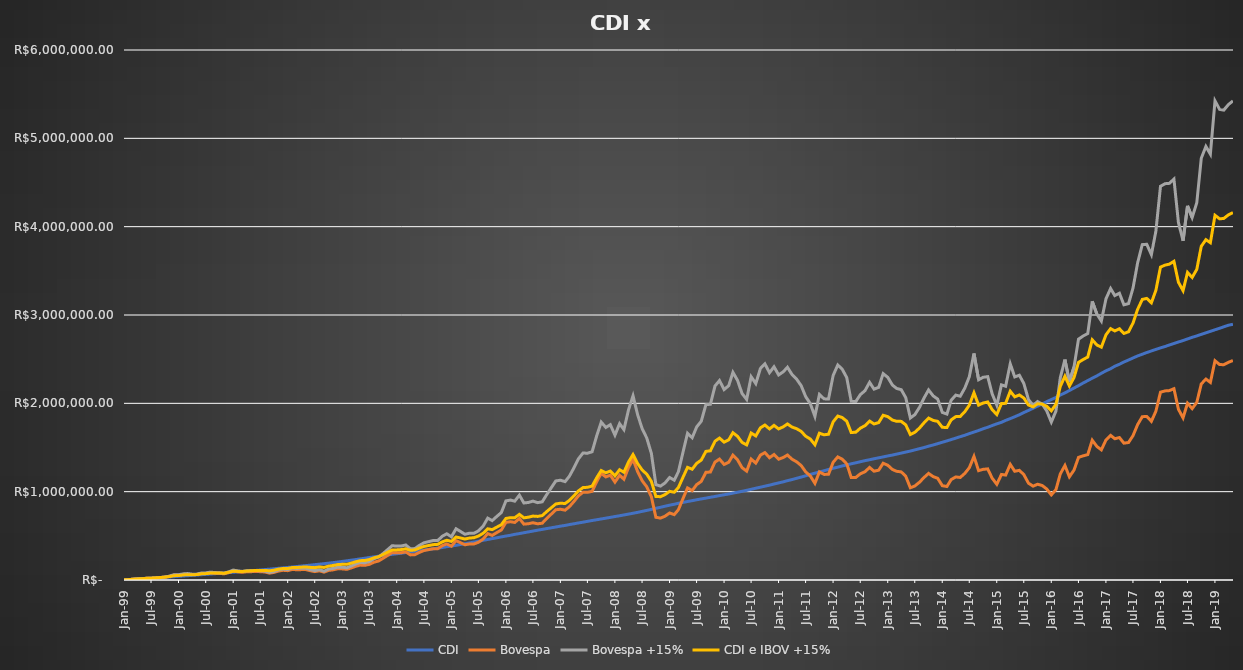
| Category | CDI | Bovespa | Bovespa +15% | CDI e IBOV +15% |
|---|---|---|---|---|
| 1999-01-01 | 1000 | 1000 | 1000 | 1000 |
| 1999-01-01 | 1021.7 | 1204.5 | 1235.175 | 1128.438 |
| 1999-02-01 | 4116.21 | 4585.428 | 4676.438 | 4396.324 |
| 1999-03-01 | 7349.622 | 9104.789 | 9444.667 | 8397.144 |
| 1999-04-01 | 10585.593 | 12845.602 | 13320.523 | 11953.058 |
| 1999-05-01 | 13851.871 | 15481.153 | 15945.151 | 14898.511 |
| 1999-06-01 | 17128.241 | 19375.641 | 19999.638 | 18563.94 |
| 1999-07-01 | 20454.319 | 20095.563 | 20655.975 | 20555.147 |
| 1999-08-01 | 23817.861 | 23368.091 | 23976.986 | 23897.423 |
| 1999-09-01 | 27212.083 | 27718.137 | 28565.391 | 27888.737 |
| 1999-10-01 | 30629.01 | 32361.557 | 33507.452 | 32068.231 |
| 1999-11-01 | 34089.728 | 41645.306 | 43967.932 | 39028.83 |
| 1999-12-01 | 37675.745 | 55378.038 | 59952.687 | 48814.216 |
| 2000-01-01 | 41261.476 | 55972.862 | 60359.036 | 50810.256 |
| 2000-02-01 | 44898.841 | 63549.157 | 69013.196 | 56956.019 |
| 2000-03-01 | 48588.584 | 67154.754 | 72766.814 | 60677.699 |
| 2000-04-01 | 52248.918 | 61167.93 | 66061.086 | 59155.002 |
| 2000-05-01 | 56072.127 | 61768.049 | 66478.201 | 61275.164 |
| 2000-06-01 | 59893.23 | 72436.586 | 78938.353 | 69415.791 |
| 2000-07-01 | 63710.842 | 74206.97 | 80602.758 | 72156.8 |
| 2000-08-01 | 67644.794 | 81391.588 | 88813.717 | 78229.256 |
| 2000-09-01 | 71506.66 | 77488.356 | 84303.355 | 77905.008 |
| 2000-10-01 | 75460.345 | 75127.831 | 81488.952 | 78474.649 |
| 2000-11-01 | 79409.716 | 69822.843 | 75507.776 | 77458.746 |
| 2000-12-01 | 83390.391 | 83629.753 | 91905.913 | 87648.152 |
| 2001-01-01 | 87478.91 | 100334.58 | 112172.146 | 99825.528 |
| 2001-02-01 | 91392.747 | 92918.454 | 103562.794 | 97477.77 |
| 2001-03-01 | 95572.656 | 87151.507 | 96822.955 | 96197.805 |
| 2001-04-01 | 99735.814 | 93144.537 | 103634.195 | 101685.004 |
| 2001-05-01 | 104102.2 | 94423.55 | 104725.443 | 104413.821 |
| 2001-06-01 | 108462.398 | 96819.524 | 107057.545 | 107759.972 |
| 2001-07-01 | 113134.334 | 94299.505 | 103971.363 | 108552.848 |
| 2001-08-01 | 117992.483 | 90838.817 | 99868.464 | 108930.474 |
| 2001-09-01 | 122589.584 | 77726.692 | 85205.949 | 103897.767 |
| 2001-10-01 | 127523.664 | 86256.471 | 95154.373 | 111339.018 |
| 2001-11-01 | 132337.943 | 101564.938 | 113720.184 | 123029.063 |
| 2001-12-01 | 137219.14 | 109782.729 | 123418.172 | 130318.656 |
| 2002-01-01 | 142364.493 | 105666.139 | 118441.185 | 130402.839 |
| 2002-02-01 | 147181.549 | 119869.617 | 135839.859 | 141510.704 |
| 2002-03-01 | 152239.036 | 116050.354 | 131134.247 | 141686.642 |
| 2002-04-01 | 157536.574 | 117526.509 | 132417.329 | 144976.951 |
| 2002-05-01 | 162784.086 | 118465.506 | 133101.692 | 147942.889 |
| 2002-06-01 | 167955.858 | 105201.275 | 117877.676 | 142916.767 |
| 2002-07-01 | 173588.578 | 94827.597 | 105937.195 | 139762.886 |
| 2002-08-01 | 179149.112 | 104039.649 | 116892.334 | 148020.723 |
| 2002-09-01 | 184662.77 | 88896.429 | 99570.583 | 142116.676 |
| 2002-10-01 | 190740.439 | 108364.269 | 123708.329 | 157224.384 |
| 2002-11-01 | 196704.668 | 115094.972 | 131589.767 | 164147.218 |
| 2002-12-01 | 203159.559 | 126633.238 | 145780.233 | 174469.896 |
| 2003-01-01 | 210220.902 | 125860.911 | 144450.729 | 177335.815 |
| 2003-02-01 | 217122.845 | 121077.712 | 138544.705 | 177833.775 |
| 2003-03-01 | 224019.019 | 136063.619 | 157268.906 | 190643.962 |
| 2003-04-01 | 231264.275 | 154889.059 | 181243.298 | 206253.786 |
| 2003-05-01 | 238855.854 | 168767.615 | 198841.815 | 218848.835 |
| 2003-06-01 | 246330.188 | 166013.4 | 195080.114 | 220705.151 |
| 2003-07-01 | 254516.256 | 176821.819 | 208604.111 | 231560.183 |
| 2003-08-01 | 262048.542 | 201058.776 | 240343.123 | 251195.832 |
| 2003-09-01 | 269474.852 | 215302.414 | 258762.56 | 264118.706 |
| 2003-10-01 | 276916.192 | 245197.272 | 298849.08 | 287882.636 |
| 2003-11-01 | 283667.069 | 278576.618 | 344337.356 | 314002.213 |
| 2003-12-01 | 290594.408 | 310212.96 | 387960.197 | 339277.302 |
| 2004-01-01 | 297293.698 | 307794.376 | 384196.585 | 340745.142 |
| 2004-02-01 | 303536.87 | 309426.881 | 385492.92 | 344514.895 |
| 2004-03-01 | 310736.425 | 317988.079 | 396445.37 | 353590.898 |
| 2004-04-01 | 317407.141 | 284234.944 | 353708.875 | 335558.008 |
| 2004-05-01 | 324316.108 | 286315.792 | 355567.407 | 339941.758 |
| 2004-06-01 | 331309.365 | 313068.619 | 392421.549 | 361865.457 |
| 2004-07-01 | 338588.525 | 333831.675 | 420977.643 | 379783.084 |
| 2004-08-01 | 345995.016 | 343871.457 | 434167.946 | 390081.481 |
| 2004-09-01 | 353322.555 | 353600.763 | 446921.163 | 400121.859 |
| 2004-10-01 | 360634.058 | 353640.977 | 446186.817 | 403410.437 |
| 2004-11-01 | 368179.483 | 388774.329 | 495729.309 | 431954.396 |
| 2004-12-01 | 376672.94 | 408424.738 | 523104.704 | 449888.822 |
| 2005-01-01 | 384912.426 | 382460.437 | 489066.933 | 436989.68 |
| 2005-02-01 | 392644.958 | 445399.534 | 580060.803 | 486352.88 |
| 2005-03-01 | 401658.761 | 424051.44 | 551400.601 | 476529.681 |
| 2005-04-01 | 410364.45 | 398695.224 | 517588.401 | 463976.425 |
| 2005-05-01 | 419564.916 | 407559.974 | 529329.08 | 474446.998 |
| 2005-06-01 | 429241.442 | 408014.503 | 529028.64 | 479135.041 |
| 2005-07-01 | 438768.288 | 427290.677 | 556257.224 | 497512.756 |
| 2005-08-01 | 449057.465 | 463380.03 | 608715.137 | 528886.301 |
| 2005-09-01 | 458838.327 | 525237.19 | 700493.355 | 579665.841 |
| 2005-10-01 | 468304.063 | 504994.753 | 672539.647 | 570421.855 |
| 2005-11-01 | 477808.059 | 537001.254 | 719898.958 | 598853.509 |
| 2005-12-01 | 487875.938 | 566029.314 | 762969.247 | 625422.593 |
| 2006-01-01 | 497895.464 | 652847.332 | 895720.608 | 696808.036 |
| 2006-02-01 | 506605.672 | 659716.831 | 904818.427 | 705712.05 |
| 2006-03-01 | 516842.073 | 651384.374 | 892294.732 | 704568.402 |
| 2006-04-01 | 525456.367 | 695937.781 | 960673.63 | 743064.998 |
| 2006-05-01 | 535220.608 | 632538.692 | 872124.635 | 703672.622 |
| 2006-06-01 | 544571.612 | 637318.2 | 877942.537 | 711257.074 |
| 2006-07-01 | 553978.199 | 648130.082 | 893302.16 | 723640.18 |
| 2006-08-01 | 563940.427 | 636284.317 | 875866.471 | 719903.449 |
| 2006-09-01 | 572893.301 | 643120.022 | 884930.65 | 728911.976 |
| 2006-10-01 | 582170.538 | 696000.488 | 966761.133 | 774465.836 |
| 2006-11-01 | 591139.278 | 746532.521 | 1045596.453 | 818367.866 |
| 2006-12-01 | 599961.843 | 794954.192 | 1121673.14 | 860817.491 |
| 2007-01-01 | 609473.831 | 800986.418 | 1129587.962 | 869530.896 |
| 2007-02-01 | 617802.353 | 790479.446 | 1113560.484 | 865681.419 |
| 2007-03-01 | 627320.778 | 828075.15 | 1172544.827 | 899932.802 |
| 2007-04-01 | 636245.793 | 888253.121 | 1268553.933 | 952399.863 |
| 2007-05-01 | 645766.1 | 951590.957 | 1370550.765 | 1008158.433 |
| 2007-06-01 | 654604.995 | 993347.35 | 1437681.85 | 1046143.423 |
| 2007-07-01 | 663983.763 | 992461.595 | 1435063.191 | 1049523.477 |
| 2007-08-01 | 673586.903 | 1003823.472 | 1451954.881 | 1062770.892 |
| 2007-09-01 | 681999.598 | 1114251.537 | 1633485.12 | 1157742.359 |
| 2007-10-01 | 691301.594 | 1206966.835 | 1787606.338 | 1239453.966 |
| 2007-11-01 | 700133.728 | 1167134.009 | 1727218.874 | 1213676.301 |
| 2007-12-01 | 709040.051 | 1186515.885 | 1758075.398 | 1233557.724 |
| 2008-01-01 | 718602.212 | 1107677.193 | 1639913.411 | 1179257.811 |
| 2008-02-01 | 727337.506 | 1185314.7 | 1769877.759 | 1248607.633 |
| 2008-03-01 | 736459.926 | 1141138.606 | 1702494.512 | 1219477.219 |
| 2008-04-01 | 746100.276 | 1273655.096 | 1927515.787 | 1336808.032 |
| 2008-05-01 | 755624.939 | 1365510.291 | 2085034.271 | 1420329.605 |
| 2008-06-01 | 765818.221 | 1225774.668 | 1870252.297 | 1318035.259 |
| 2008-07-01 | 776998.447 | 1124574.576 | 1714400.502 | 1245699.474 |
| 2008-08-01 | 787898.271 | 1055071.531 | 1606971.65 | 1197434.96 |
| 2008-09-01 | 799584.707 | 941366.241 | 1432391.777 | 1115988.242 |
| 2008-10-01 | 812006.249 | 710163.413 | 1079414.616 | 945710.432 |
| 2008-11-01 | 823123.711 | 700540.421 | 1063255.877 | 943189.794 |
| 2008-12-01 | 835301.945 | 721902.826 | 1098259.547 | 966780.746 |
| 2009-01-01 | 847042.92 | 758683.297 | 1160276.047 | 1003659.483 |
| 2009-02-01 | 857291.236 | 740051.492 | 1130239.007 | 993765.121 |
| 2009-03-01 | 868605.951 | 796402.589 | 1226810.552 | 1047708.251 |
| 2009-04-01 | 878889.09 | 923709.691 | 1449731.424 | 1164310.257 |
| 2009-05-01 | 888647.888 | 1042455.732 | 1661394.502 | 1275021.195 |
| 2009-06-01 | 898347.73 | 1011373.875 | 1610135.241 | 1254241.485 |
| 2009-07-01 | 908414.296 | 1079395.24 | 1732047.505 | 1320230.901 |
| 2009-08-01 | 917715.815 | 1116490.691 | 1797899.601 | 1357807.708 |
| 2009-09-01 | 927082.565 | 1219125.362 | 1985221.675 | 1456152.12 |
| 2009-10-01 | 936511.295 | 1222614.212 | 1989136.257 | 1462823.776 |
| 2009-11-01 | 945702.675 | 1335061.561 | 2196718.69 | 1571210.682 |
| 2009-12-01 | 955569.385 | 1368836.977 | 2257901.25 | 1606735.317 |
| 2010-01-01 | 964878.688 | 1308046.558 | 2155769.341 | 1560324.015 |
| 2010-02-01 | 973613.37 | 1333072.14 | 2200476.765 | 1587045.067 |
| 2010-03-01 | 984005.356 | 1413831.538 | 2350955.465 | 1667480.411 |
| 2010-04-01 | 993558.085 | 1359591.544 | 2258855.664 | 1626206.874 |
| 2010-05-01 | 1004032.27 | 1272115.466 | 2111668.448 | 1557850.359 |
| 2010-06-01 | 1014995.882 | 1232399.098 | 2043827.055 | 1529411.468 |
| 2010-07-01 | 1026742.502 | 1368822.2 | 2301042.975 | 1663892.739 |
| 2010-08-01 | 1038869.11 | 1323671.241 | 2223171.067 | 1631020.088 |
| 2010-09-01 | 1050667.695 | 1413966.209 | 2394625.432 | 1722646.563 |
| 2010-10-01 | 1062156.042 | 1442329.904 | 2446980.551 | 1754568.296 |
| 2010-11-01 | 1073736.939 | 1384626.048 | 2347081.368 | 1710409.153 |
| 2010-12-01 | 1086719.367 | 1420374.023 | 2413862.576 | 1750290.971 |
| 2011-01-01 | 1099097.492 | 1367293.086 | 2321638.191 | 1710367.841 |
| 2011-02-01 | 1111381.561 | 1386873.632 | 2356985.531 | 1734183.546 |
| 2011-03-01 | 1124620.499 | 1414752.37 | 2408565.833 | 1766593.166 |
| 2011-04-01 | 1137078.979 | 1366996.836 | 2325231.776 | 1731155.378 |
| 2011-05-01 | 1151311.038 | 1338623.908 | 2274915.269 | 1713113.153 |
| 2011-06-01 | 1165307.004 | 1295606.208 | 2199782.775 | 1682544.89 |
| 2011-07-01 | 1179598.692 | 1224066.212 | 2076343.044 | 1627970.868 |
| 2011-08-01 | 1195279.697 | 1178474.39 | 1997001.059 | 1596140.378 |
| 2011-09-01 | 1209539.932 | 1094281.58 | 1852400.981 | 1530970.456 |
| 2011-10-01 | 1223218.771 | 1223359.233 | 2100564.39 | 1661891.58 |
| 2011-11-01 | 1236747.085 | 1195577.616 | 2050764.924 | 1643756.004 |
| 2011-12-01 | 1250961.837 | 1196060.603 | 2049452.017 | 1650206.927 |
| 2012-01-01 | 1265063.162 | 1332516.049 | 2315155.613 | 1790109.387 |
| 2012-02-01 | 1277465.85 | 1393477.445 | 2433854.76 | 1855660.305 |
| 2012-03-01 | 1290815.855 | 1368827.192 | 2388605.036 | 1839710.445 |
| 2012-04-01 | 1302871.273 | 1314621.998 | 2291875.106 | 1797373.189 |
| 2012-05-01 | 1315435.474 | 1161352.029 | 2022702.918 | 1669069.196 |
| 2012-06-01 | 1326853.684 | 1161441.149 | 2020638.661 | 1673746.173 |
| 2012-07-01 | 1338835.516 | 1201819.71 | 2098341.282 | 1718588.399 |
| 2012-08-01 | 1351047.217 | 1225542.609 | 2142905.812 | 1746976.515 |
| 2012-09-01 | 1361319.804 | 1274121.539 | 2237460.884 | 1799390.344 |
| 2012-10-01 | 1372603.954 | 1231656.013 | 2160700.476 | 1766652.215 |
| 2012-11-01 | 1383092.742 | 1243422.07 | 2181367.091 | 1782229.917 |
| 2012-12-01 | 1393497.25 | 1321830.606 | 2336344.431 | 1864920.84 |
| 2013-01-01 | 1404689.103 | 1298996.409 | 2293727.215 | 1849208.159 |
| 2013-02-01 | 1414467.126 | 1251088.349 | 2206925.181 | 1810696.153 |
| 2013-03-01 | 1425088.846 | 1230636.897 | 2168599.58 | 1796844.213 |
| 2013-04-01 | 1436668.804 | 1224014.529 | 2154661.103 | 1795664.954 |
| 2013-05-01 | 1448087.987 | 1174252.905 | 2064881.676 | 1756484.831 |
| 2013-06-01 | 1459676.977 | 1044105.601 | 1834004.258 | 1646840.618 |
| 2013-07-01 | 1473042.969 | 1064278.133 | 1871650.158 | 1672346.564 |
| 2013-08-01 | 1486311.8 | 1106553.968 | 1953985.353 | 1720148.576 |
| 2013-09-01 | 1499723.579 | 1161148.228 | 2061635.145 | 1780679.362 |
| 2013-10-01 | 1514794.957 | 1206756.053 | 2151535.638 | 1833165.298 |
| 2013-11-01 | 1528578.89 | 1170197.03 | 2084082.323 | 1806330.607 |
| 2013-12-01 | 1543529.8 | 1151375.565 | 2048262.592 | 1795896.196 |
| 2014-01-01 | 1559516.011 | 1067681.96 | 1897212.771 | 1728364.391 |
| 2014-02-01 | 1574744.261 | 1058476.186 | 1878550.345 | 1726647.303 |
| 2014-03-01 | 1589733.54 | 1136310.257 | 2034097.04 | 1811915.29 |
| 2014-04-01 | 1605720.689 | 1166653.703 | 2093320.918 | 1849520.804 |
| 2014-05-01 | 1622526.73 | 1160881.3 | 2080598.511 | 1851562.621 |
| 2014-06-01 | 1638813.786 | 1207643.237 | 2173693.311 | 1906253.548 |
| 2014-07-01 | 1657253.403 | 1271296.463 | 2302103.496 | 1979678.449 |
| 2014-08-01 | 1674523.281 | 1398922.658 | 2564358.486 | 2119440.883 |
| 2014-09-01 | 1692629.378 | 1237897.707 | 2266977.543 | 1979803.46 |
| 2014-10-01 | 1711649.684 | 1252686.235 | 2294777.048 | 2003213.366 |
| 2014-11-01 | 1729015.019 | 1257820.901 | 2302269.202 | 2015642.11 |
| 2014-12-01 | 1748569.619 | 1152138.14 | 2106554.997 | 1927562.308 |
| 2015-01-01 | 1767846.955 | 1083519.575 | 1978762.587 | 1873304.771 |
| 2015-02-01 | 1785341.337 | 1194845.577 | 2208981.576 | 1997161.457 |
| 2015-03-01 | 1806870.342 | 1187783.674 | 2193400.931 | 2000135.637 |
| 2015-04-01 | 1827031.533 | 1309028.493 | 2447218.935 | 2137125.234 |
| 2015-05-01 | 1848035.383 | 1231076.335 | 2299040.427 | 2073537.905 |
| 2015-06-01 | 1870763.718 | 1241604.2 | 2318189.241 | 2094476.479 |
| 2015-07-01 | 1895823.538 | 1192704.205 | 2224395.649 | 2060109.594 |
| 2015-08-01 | 1919851.11 | 1096102.045 | 2041853.592 | 1980852.351 |
| 2015-09-01 | 1944144.763 | 1062172.216 | 1976146.511 | 1960145.637 |
| 2015-10-01 | 1968713.286 | 1084345.316 | 2020114.844 | 1994414.065 |
| 2015-11-01 | 1992516.833 | 1069621.587 | 1990138.072 | 1991327.452 |
| 2015-12-01 | 2018690.77 | 1030574.821 | 1915007.059 | 1966848.915 |
| 2016-01-01 | 2043017.586 | 963395.091 | 1787774.38 | 1915395.983 |
| 2016-02-01 | 2066506.406 | 1023509.041 | 1912484.361 | 1989495.383 |
| 2016-03-01 | 2093523.028 | 1200707.625 | 2289300.711 | 2191411.869 |
| 2016-04-01 | 2118628.766 | 1296393.112 | 2495283.939 | 2306956.353 |
| 2016-05-01 | 2145123.683 | 1168284.347 | 2246207.09 | 2195665.387 |
| 2016-06-01 | 2173052.659 | 1245075.261 | 2412162.143 | 2292607.401 |
| 2016-07-01 | 2200150.266 | 1388109.305 | 2726790.515 | 2463470.39 |
| 2016-08-01 | 2229885.494 | 1405437.731 | 2762124.883 | 2496005.189 |
| 2016-09-01 | 2257612.468 | 1419705.233 | 2790564.032 | 2524088.25 |
| 2016-10-01 | 2284290.123 | 1582475.03 | 3154338.859 | 2719314.491 |
| 2016-11-01 | 2311004.747 | 1511750.442 | 3010522.602 | 2660763.675 |
| 2016-12-01 | 2339960.938 | 1473700.705 | 2931856.14 | 2635908.539 |
| 2017-01-01 | 2368372.693 | 1585681.217 | 3183937.38 | 2776155.037 |
| 2017-02-01 | 2391856.61 | 1637612.598 | 3299818.702 | 2845837.656 |
| 2017-03-01 | 2420012.184 | 1599269.161 | 3219587.671 | 2819799.928 |
| 2017-04-01 | 2442037.676 | 1612523.683 | 3246305.916 | 2844171.796 |
| 2017-05-01 | 2467666.499 | 1548964.107 | 3115434.513 | 2791550.506 |
| 2017-06-01 | 2490631.955 | 1556620 | 3129193.112 | 2809912.534 |
| 2017-07-01 | 2513508.696 | 1634481.76 | 3305090.171 | 2909299.434 |
| 2017-08-01 | 2536675.996 | 1759637.899 | 3591891.227 | 3064283.612 |
| 2017-09-01 | 2555871.51 | 1848654.629 | 3796636.523 | 3176254.017 |
| 2017-10-01 | 2575327.613 | 1852024.959 | 3800510.439 | 3187919.026 |
| 2017-11-01 | 2592957.044 | 1796591.673 | 3683699.861 | 3138328.452 |
| 2017-12-01 | 2609912.909 | 1910446.52 | 3947865.679 | 3278889.294 |
| 2018-01-01 | 2628154.03 | 2126604.463 | 4457011.081 | 3542582.555 |
| 2018-02-01 | 2643386.265 | 2140678.406 | 4486681.947 | 3565034.106 |
| 2018-03-01 | 2660451.808 | 2143892.774 | 4490198.26 | 3575325.034 |
| 2018-04-01 | 2677235.171 | 2165785.43 | 4538669.427 | 3607952.299 |
| 2018-05-01 | 2694105.388 | 1933038.454 | 4047989.96 | 3371047.674 |
| 2018-06-01 | 2711062.908 | 1835364.454 | 3840338.482 | 3275700.695 |
| 2018-07-01 | 2728778.557 | 2001611.218 | 4235820.208 | 3482299.383 |
| 2018-08-01 | 2747265.01 | 1940263.198 | 4102754.079 | 3425009.545 |
| 2018-09-01 | 2763139.001 | 2010888.757 | 4270066.358 | 3516602.679 |
| 2018-10-01 | 2781159.135 | 2219104.021 | 4773805.639 | 3777482.387 |
| 2018-11-01 | 2797898.961 | 2274990.097 | 4907546.809 | 3852722.885 |
| 2018-12-01 | 2814721.397 | 2236758.476 | 4821665.912 | 3818193.654 |
| 2019-01-01 | 2833021.624 | 2482100.343 | 5424999.091 | 4129010.358 |
| 2019-02-01 | 2850017.391 | 2438877.477 | 5327038.308 | 4088527.85 |
| 2019-03-01 | 2866392.336 | 2437482.098 | 5320444.239 | 4093418.288 |
| 2019-04-01 | 2884313.177 | 2464398.822 | 5383439.456 | 4133876.316 |
| 2019-05-01 | 2894531.46 | 2484670.614 | 5424144.532 | 4159337.996 |